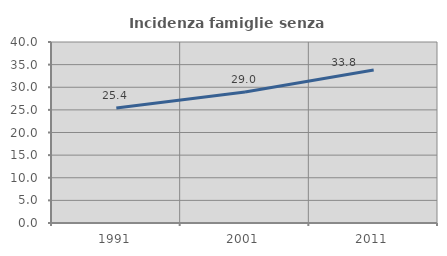
| Category | Incidenza famiglie senza nuclei |
|---|---|
| 1991.0 | 25.426 |
| 2001.0 | 28.97 |
| 2011.0 | 33.834 |